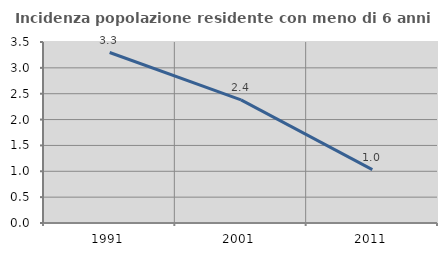
| Category | Incidenza popolazione residente con meno di 6 anni |
|---|---|
| 1991.0 | 3.297 |
| 2001.0 | 2.381 |
| 2011.0 | 1.031 |